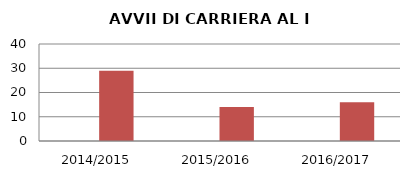
| Category | ANNO | NUMERO |
|---|---|---|
| 2014/2015 | 0 | 29 |
| 2015/2016 | 0 | 14 |
| 2016/2017 | 0 | 16 |